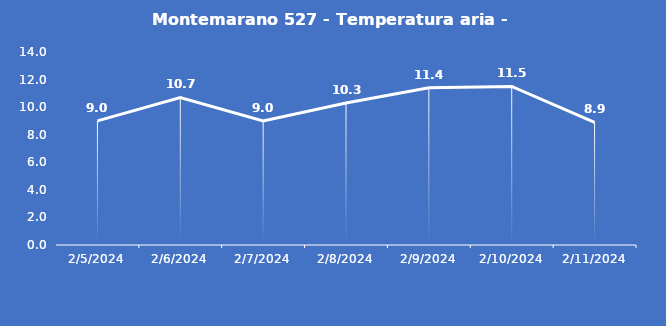
| Category | Montemarano 527 - Temperatura aria - Grezzo (°C) |
|---|---|
| 2/5/24 | 9 |
| 2/6/24 | 10.7 |
| 2/7/24 | 9 |
| 2/8/24 | 10.3 |
| 2/9/24 | 11.4 |
| 2/10/24 | 11.5 |
| 2/11/24 | 8.9 |